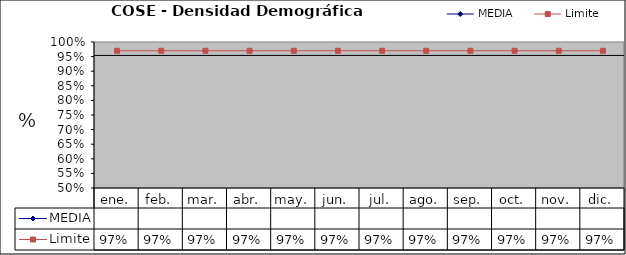
| Category | MEDIA | Limite |
|---|---|---|
| ene. |  | 0.97 |
| feb. |  | 0.97 |
| mar. |  | 0.97 |
| abr. |  | 0.97 |
| may. |  | 0.97 |
| jun. |  | 0.97 |
| jul. |  | 0.97 |
| ago. |  | 0.97 |
| sep. |  | 0.97 |
| oct. |  | 0.97 |
| nov. |  | 0.97 |
| dic. |  | 0.97 |